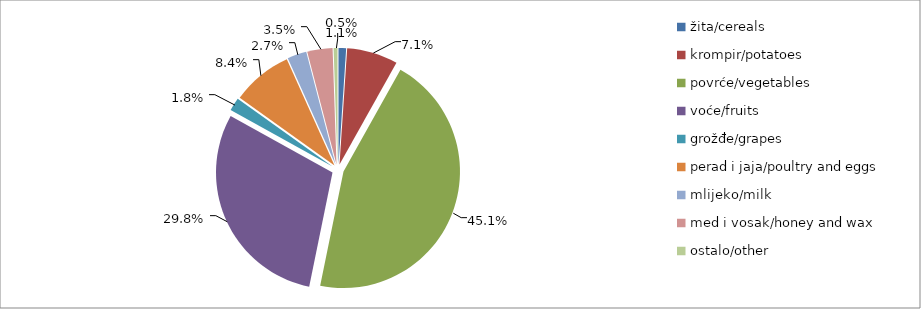
| Category | Series 0 |
|---|---|
| žita/cereals | 25799 |
| krompir/potatoes | 173627 |
| povrće/vegetables | 1105887.5 |
| voće/fruits | 732217.5 |
| grožđe/grapes | 44514 |
| perad i jaja/poultry and eggs | 206381.5 |
| mlijeko/milk | 65543.5 |
| med i vosak/honey and wax | 86041 |
| ostalo/other | 13155 |